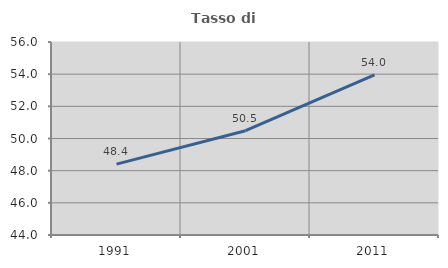
| Category | Tasso di occupazione   |
|---|---|
| 1991.0 | 48.41 |
| 2001.0 | 50.483 |
| 2011.0 | 53.953 |